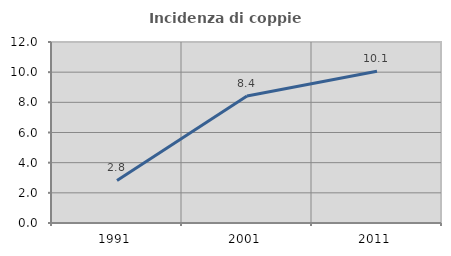
| Category | Incidenza di coppie miste |
|---|---|
| 1991.0 | 2.824 |
| 2001.0 | 8.423 |
| 2011.0 | 10.063 |